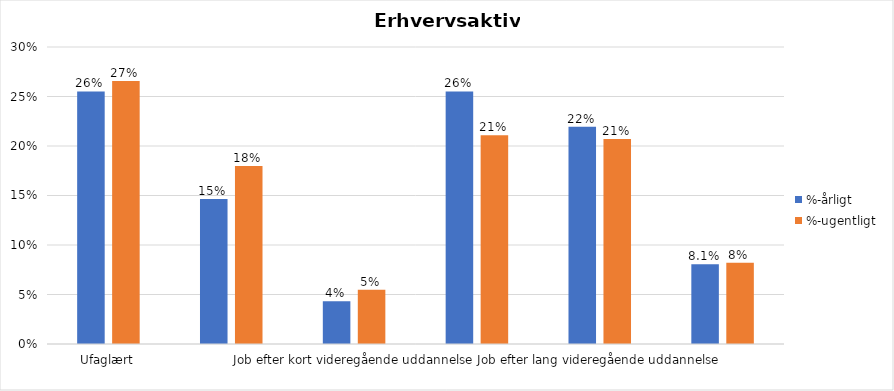
| Category | %-årligt | %-ugentligt |
|---|---|---|
| Ufaglært | 0.255 | 0.266 |
| Erhvervsfagligt job | 0.146 | 0.18 |
| Job efter kort videregående uddannelse | 0.043 | 0.055 |
| Job efter mellemlang videregående uddannelse | 0.255 | 0.211 |
| Job efter lang videregående uddannelse | 0.22 | 0.207 |
| Selvstændig | 0.081 | 0.082 |